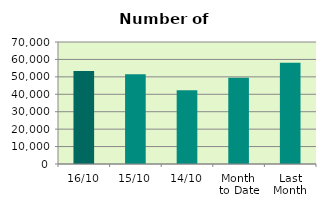
| Category | Series 0 |
|---|---|
| 16/10 | 53336 |
| 15/10 | 51516 |
| 14/10 | 42358 |
| Month 
to Date | 49464.167 |
| Last
Month | 58072.091 |